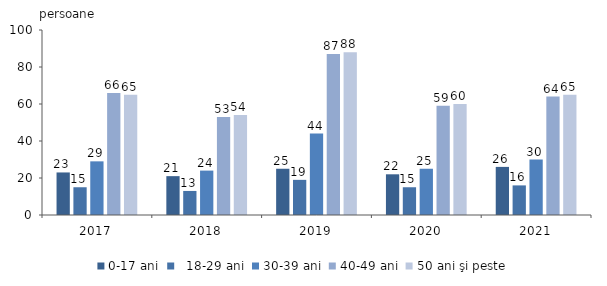
| Category | 0-17 ani |   18-29 ani | 30-39 ani | 40-49 ani | 50 ani şi peste |
|---|---|---|---|---|---|
| 2017.0 | 23 | 15 | 29 | 66 | 65 |
| 2018.0 | 21 | 13 | 24 | 53 | 54 |
| 2019.0 | 25 | 19 | 44 | 87 | 88 |
| 2020.0 | 22 | 15 | 25 | 59 | 60 |
| 2021.0 | 26 | 16 | 30 | 64 | 65 |